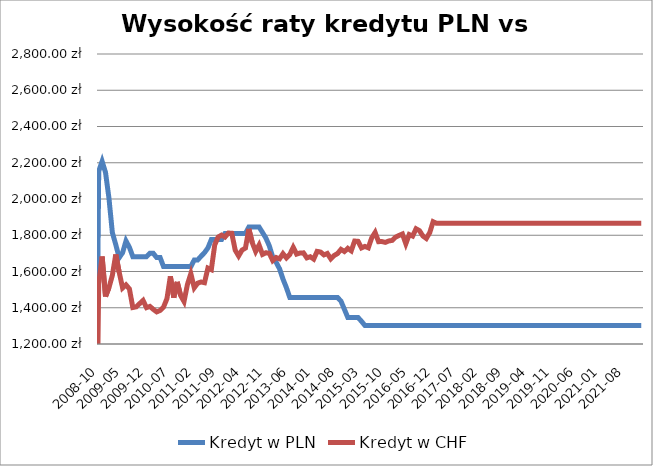
| Category | Kredyt w PLN | Kredyt w CHF |
|---|---|---|
| 2006-09-01 | 0 | 0 |
| 2006-10-01 | 0 | 0 |
| 2006-11-01 | 0 | 0 |
| 2006-12-01 | 0 | 0 |
| 2007-01-01 | 0 | 0 |
| 2007-02-01 | 0 | 0 |
| 2007-03-01 | 0 | 0 |
| 2007-04-01 | 0 | 0 |
| 2007-05-01 | 0 | 0 |
| 2007-06-01 | 0 | 0 |
| 2007-07-01 | 0 | 0 |
| 2007-08-01 | 0 | 0 |
| 2007-09-01 | 0 | 0 |
| 2007-10-01 | 0 | 0 |
| 2007-11-01 | 0 | 0 |
| 2007-12-01 | 0 | 0 |
| 2008-01-01 | 0 | 0 |
| 2008-02-01 | 0 | 0 |
| 2008-03-01 | 0 | 0 |
| 2008-04-01 | 0 | 0 |
| 2008-05-01 | 0 | 0 |
| 2008-06-01 | 0 | 0 |
| 2008-07-01 | 0 | 0 |
| 2008-08-01 | 0 | 0 |
| 2008-09-01 | 0 | 0 |
| 2008-10-01 | 2152.278 | 1532.127 |
| 2008-11-01 | 2207.865 | 1682.637 |
| 2008-12-01 | 2146.22 | 1462.444 |
| 2009-01-01 | 2005.133 | 1510.193 |
| 2009-02-01 | 1814.385 | 1578.828 |
| 2009-03-01 | 1748.347 | 1694.322 |
| 2009-04-01 | 1676.186 | 1596.218 |
| 2009-05-01 | 1703.724 | 1509.054 |
| 2009-06-01 | 1768.646 | 1526.186 |
| 2009-07-01 | 1733.332 | 1503.914 |
| 2009-08-01 | 1681.976 | 1401.331 |
| 2009-09-01 | 1681.976 | 1405.069 |
| 2009-10-01 | 1681.976 | 1423.017 |
| 2009-11-01 | 1681.976 | 1440.308 |
| 2009-12-01 | 1681.976 | 1400.713 |
| 2010-01-01 | 1700.057 | 1407.312 |
| 2010-02-01 | 1700.057 | 1391.146 |
| 2010-03-01 | 1676.661 | 1377.181 |
| 2010-04-01 | 1676.661 | 1385.314 |
| 2010-05-01 | 1626.988 | 1403.833 |
| 2010-06-01 | 1626.988 | 1450.171 |
| 2010-07-01 | 1626.988 | 1573.662 |
| 2010-08-01 | 1626.988 | 1455.816 |
| 2010-09-01 | 1626.988 | 1542.589 |
| 2010-10-01 | 1626.988 | 1467.506 |
| 2010-11-01 | 1626.988 | 1434.635 |
| 2010-12-01 | 1626.988 | 1528.602 |
| 2011-01-01 | 1626.988 | 1588.099 |
| 2011-02-01 | 1663.475 | 1510.418 |
| 2011-03-01 | 1663.475 | 1535.596 |
| 2011-04-01 | 1684.409 | 1542.19 |
| 2011-05-01 | 1703.666 | 1538.143 |
| 2011-06-01 | 1730.037 | 1618.722 |
| 2011-07-01 | 1776.096 | 1610.13 |
| 2011-08-01 | 1776.096 | 1747.109 |
| 2011-09-01 | 1776.096 | 1790.099 |
| 2011-10-01 | 1776.096 | 1800.852 |
| 2011-11-01 | 1809.824 | 1790.198 |
| 2011-12-01 | 1809.824 | 1812.196 |
| 2012-01-01 | 1809.824 | 1810.864 |
| 2012-02-01 | 1809.824 | 1717.643 |
| 2012-03-01 | 1809.824 | 1685.78 |
| 2012-04-01 | 1809.824 | 1718.094 |
| 2012-05-01 | 1809.824 | 1729.281 |
| 2012-06-01 | 1845.118 | 1835.061 |
| 2012-07-01 | 1845.118 | 1758.848 |
| 2012-08-01 | 1845.118 | 1710.702 |
| 2012-09-01 | 1845.118 | 1745.912 |
| 2012-10-01 | 1815.35 | 1694.321 |
| 2012-11-01 | 1784.143 | 1703.511 |
| 2012-12-01 | 1741.313 | 1700.564 |
| 2013-01-01 | 1678.979 | 1660.138 |
| 2013-02-01 | 1650.776 | 1677.11 |
| 2013-03-01 | 1614.714 | 1669.956 |
| 2013-04-01 | 1558.309 | 1698.376 |
| 2013-05-01 | 1510.901 | 1675.088 |
| 2013-06-01 | 1456.702 | 1694.083 |
| 2013-07-01 | 1456.702 | 1733.062 |
| 2013-08-01 | 1456.702 | 1695.909 |
| 2013-09-01 | 1456.702 | 1702.076 |
| 2013-10-01 | 1456.702 | 1702.816 |
| 2013-11-01 | 1456.702 | 1675.088 |
| 2013-12-01 | 1456.702 | 1681.452 |
| 2014-01-01 | 1456.702 | 1668.476 |
| 2014-02-01 | 1456.702 | 1711.007 |
| 2014-03-01 | 1456.702 | 1707.504 |
| 2014-04-01 | 1456.702 | 1691.666 |
| 2014-05-01 | 1456.702 | 1699.363 |
| 2014-06-01 | 1456.702 | 1670.104 |
| 2014-07-01 | 1456.702 | 1688.36 |
| 2014-08-01 | 1456.702 | 1699.165 |
| 2014-09-01 | 1436.171 | 1722.01 |
| 2014-10-01 | 1391.404 | 1710.217 |
| 2014-11-01 | 1346.151 | 1727.733 |
| 2014-12-01 | 1346.151 | 1714.115 |
| 2015-01-01 | 1346.151 | 1767.994 |
| 2015-02-01 | 1346.151 | 1766.459 |
| 2015-03-01 | 1325.477 | 1730.152 |
| 2015-04-01 | 1302.338 | 1738.503 |
| 2015-05-01 | 1302.338 | 1730.777 |
| 2015-06-01 | 1302.338 | 1785.618 |
| 2015-07-01 | 1302.338 | 1815.409 |
| 2015-08-01 | 1302.338 | 1764.7 |
| 2015-09-01 | 1302.338 | 1765.063 |
| 2015-10-01 | 1302.338 | 1760.762 |
| 2015-11-01 | 1302.338 | 1768.458 |
| 2015-12-01 | 1302.338 | 1771.537 |
| 2016-01-01 | 1302.338 | 1789.557 |
| 2016-02-01 | 1302.338 | 1798.793 |
| 2016-03-01 | 1302.338 | 1806.897 |
| 2016-04-01 | 1302.338 | 1753.155 |
| 2016-05-01 | 1302.338 | 1803.954 |
| 2016-06-01 | 1302.338 | 1795.533 |
| 2016-07-01 | 1302.338 | 1835.783 |
| 2016-08-01 | 1302.338 | 1825.188 |
| 2016-09-01 | 1302.338 | 1795.759 |
| 2016-10-01 | 1302.338 | 1782.222 |
| 2016-11-01 | 1302.338 | 1814.005 |
| 2016-12-01 | 1302.338 | 1874.81 |
| 2017-01-01 | 1302.338 | 1865.755 |
| 2017-02-01 | 1302.338 | 1865.755 |
| 2017-03-01 | 1302.338 | 1865.755 |
| 2017-04-01 | 1302.338 | 1865.755 |
| 2017-05-01 | 1302.338 | 1865.755 |
| 2017-06-01 | 1302.338 | 1865.755 |
| 2017-07-01 | 1302.338 | 1865.755 |
| 2017-08-01 | 1302.338 | 1865.755 |
| 2017-09-01 | 1302.338 | 1865.755 |
| 2017-10-01 | 1302.338 | 1865.755 |
| 2017-11-01 | 1302.338 | 1865.755 |
| 2017-12-01 | 1302.338 | 1865.755 |
| 2018-01-01 | 1302.338 | 1865.755 |
| 2018-02-01 | 1302.338 | 1865.755 |
| 2018-03-01 | 1302.338 | 1865.755 |
| 2018-04-01 | 1302.338 | 1865.755 |
| 2018-05-01 | 1302.338 | 1865.755 |
| 2018-06-01 | 1302.338 | 1865.755 |
| 2018-07-01 | 1302.338 | 1865.755 |
| 2018-08-01 | 1302.338 | 1865.755 |
| 2018-09-01 | 1302.338 | 1865.755 |
| 2018-10-01 | 1302.338 | 1865.755 |
| 2018-11-01 | 1302.338 | 1865.755 |
| 2018-12-01 | 1302.338 | 1865.755 |
| 2019-01-01 | 1302.338 | 1865.755 |
| 2019-02-01 | 1302.338 | 1865.755 |
| 2019-03-01 | 1302.338 | 1865.755 |
| 2019-04-01 | 1302.338 | 1865.755 |
| 2019-05-01 | 1302.338 | 1865.755 |
| 2019-06-01 | 1302.338 | 1865.755 |
| 2019-07-01 | 1302.338 | 1865.755 |
| 2019-08-01 | 1302.338 | 1865.755 |
| 2019-09-01 | 1302.338 | 1865.755 |
| 2019-10-01 | 1302.338 | 1865.755 |
| 2019-11-01 | 1302.338 | 1865.755 |
| 2019-12-01 | 1302.338 | 1865.755 |
| 2020-01-01 | 1302.338 | 1865.755 |
| 2020-02-01 | 1302.338 | 1865.755 |
| 2020-03-01 | 1302.338 | 1865.755 |
| 2020-04-01 | 1302.338 | 1865.755 |
| 2020-05-01 | 1302.338 | 1865.755 |
| 2020-06-01 | 1302.338 | 1865.755 |
| 2020-07-01 | 1302.338 | 1865.755 |
| 2020-08-01 | 1302.338 | 1865.755 |
| 2020-09-01 | 1302.338 | 1865.755 |
| 2020-10-01 | 1302.338 | 1865.755 |
| 2020-11-01 | 1302.338 | 1865.755 |
| 2020-12-01 | 1302.338 | 1865.755 |
| 2021-01-01 | 1302.338 | 1865.755 |
| 2021-02-01 | 1302.338 | 1865.755 |
| 2021-03-01 | 1302.338 | 1865.755 |
| 2021-04-01 | 1302.338 | 1865.755 |
| 2021-05-01 | 1302.338 | 1865.755 |
| 2021-06-01 | 1302.338 | 1865.755 |
| 2021-07-01 | 1302.338 | 1865.755 |
| 2021-08-01 | 1302.338 | 1865.755 |
| 2021-09-01 | 1302.338 | 1865.755 |
| 2021-10-01 | 1302.338 | 1865.755 |
| 2021-11-01 | 1302.338 | 1865.755 |
| 2021-12-01 | 1302.338 | 1865.755 |
| 2022-01-01 | 1302.338 | 1865.755 |